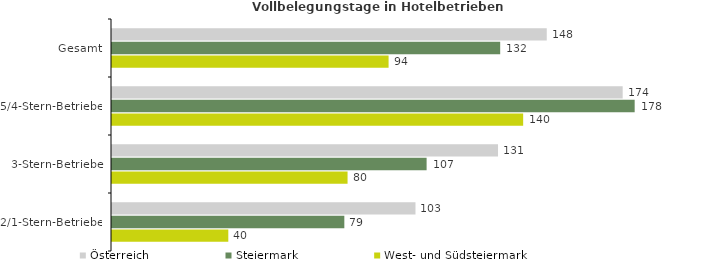
| Category | Österreich | Steiermark | West- und Südsteiermark |
|---|---|---|---|
| Gesamt | 147.876 | 132.038 | 94.074 |
| 5/4-Stern-Betriebe | 173.697 | 177.779 | 139.851 |
| 3-Stern-Betriebe | 131.294 | 107.011 | 80.122 |
| 2/1-Stern-Betriebe | 103.222 | 79.024 | 39.559 |